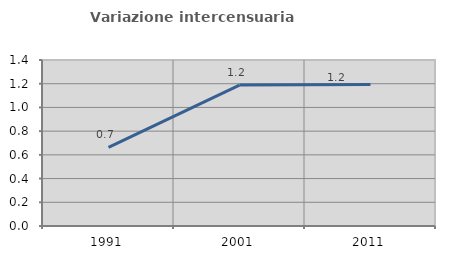
| Category | Variazione intercensuaria annua |
|---|---|
| 1991.0 | 0.662 |
| 2001.0 | 1.189 |
| 2011.0 | 1.193 |